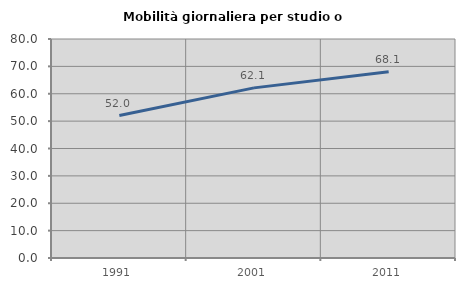
| Category | Mobilità giornaliera per studio o lavoro |
|---|---|
| 1991.0 | 52.038 |
| 2001.0 | 62.143 |
| 2011.0 | 68.057 |